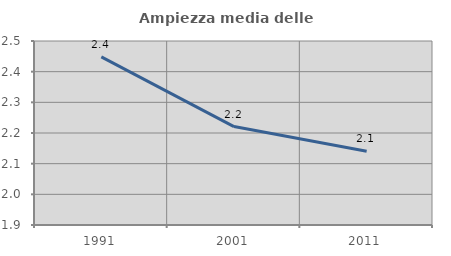
| Category | Ampiezza media delle famiglie |
|---|---|
| 1991.0 | 2.448 |
| 2001.0 | 2.221 |
| 2011.0 | 2.141 |